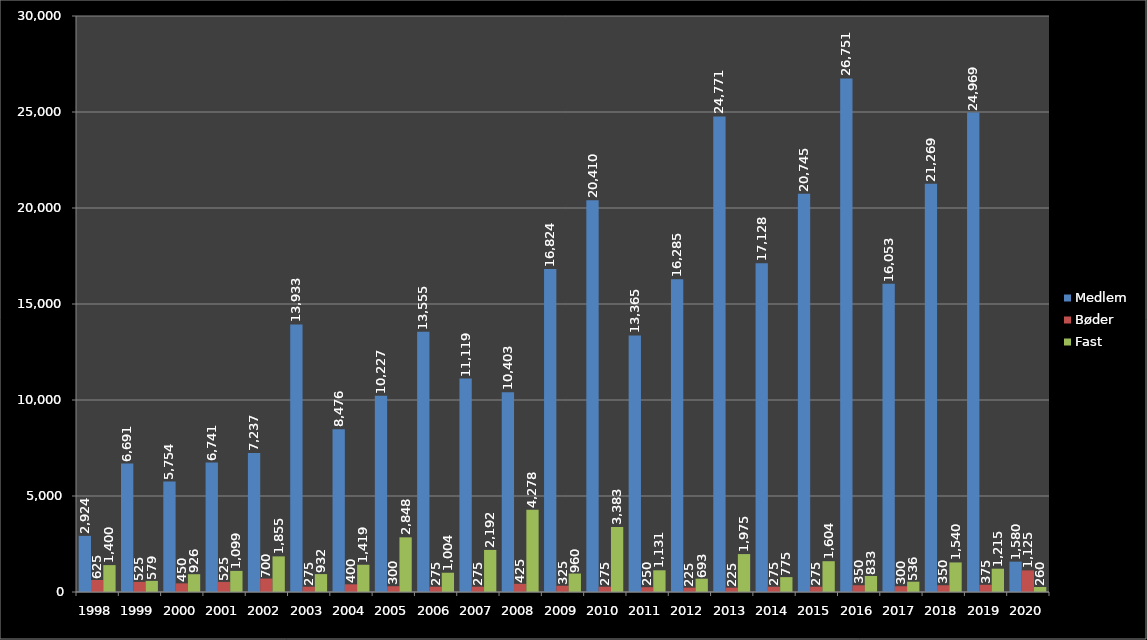
| Category | Medlem | Bøder | Fast |
|---|---|---|---|
| 1998.0 | 2924 | 625 | 1400 |
| 1999.0 | 6691 | 525 | 579 |
| 2000.0 | 5754 | 450 | 926 |
| 2001.0 | 6741 | 525 | 1099 |
| 2002.0 | 7237 | 700 | 1855 |
| 2003.0 | 13933 | 275 | 932 |
| 2004.0 | 8476 | 400 | 1419 |
| 2005.0 | 10227 | 300 | 2848 |
| 2006.0 | 13555 | 275 | 1004 |
| 2007.0 | 11119 | 275 | 2192 |
| 2008.0 | 10403 | 425 | 4278 |
| 2009.0 | 16824 | 325 | 960 |
| 2010.0 | 20410 | 275 | 3383 |
| 2011.0 | 13365 | 250 | 1131 |
| 2012.0 | 16285 | 225 | 693 |
| 2013.0 | 24771 | 225 | 1975 |
| 2014.0 | 17128 | 275 | 775 |
| 2015.0 | 20745 | 275 | 1604 |
| 2016.0 | 26751 | 350 | 833 |
| 2017.0 | 16053 | 300 | 536 |
| 2018.0 | 21269 | 350 | 1540 |
| 2019.0 | 24969 | 375 | 1215 |
| 2020.0 | 1580 | 1125 | 260 |